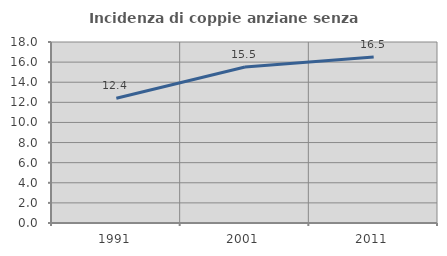
| Category | Incidenza di coppie anziane senza figli  |
|---|---|
| 1991.0 | 12.413 |
| 2001.0 | 15.509 |
| 2011.0 | 16.5 |